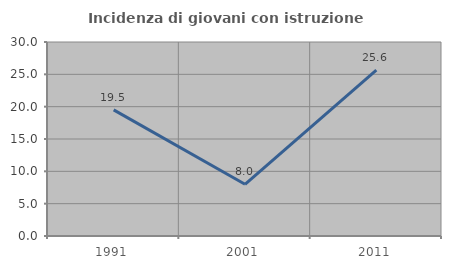
| Category | Incidenza di giovani con istruzione universitaria |
|---|---|
| 1991.0 | 19.512 |
| 2001.0 | 8 |
| 2011.0 | 25.641 |